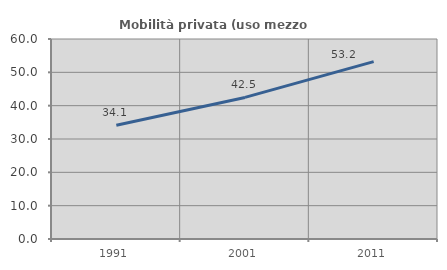
| Category | Mobilità privata (uso mezzo privato) |
|---|---|
| 1991.0 | 34.146 |
| 2001.0 | 42.475 |
| 2011.0 | 53.216 |